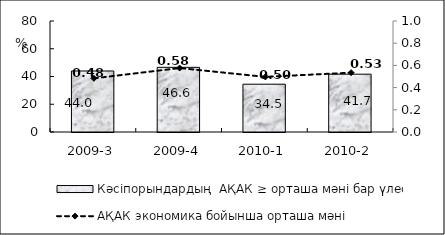
| Category | Кәсіпорындардың  АҚАК ≥ орташа мәні бар үлесі  |
|---|---|
| 2009-3 | 43.97 |
| 2009-4 | 46.61 |
| 2010-1 | 34.45 |
| 2010-2 | 41.67 |